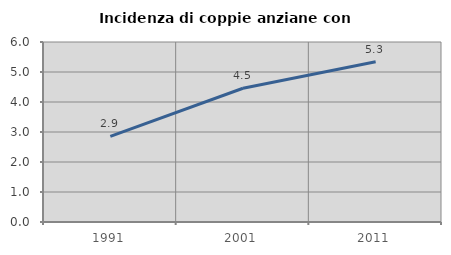
| Category | Incidenza di coppie anziane con figli |
|---|---|
| 1991.0 | 2.857 |
| 2001.0 | 4.459 |
| 2011.0 | 5.342 |